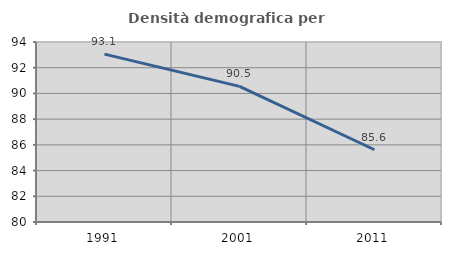
| Category | Densità demografica |
|---|---|
| 1991.0 | 93.056 |
| 2001.0 | 90.547 |
| 2011.0 | 85.619 |